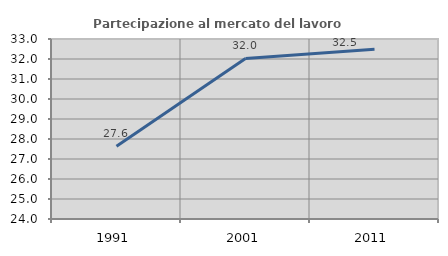
| Category | Partecipazione al mercato del lavoro  femminile |
|---|---|
| 1991.0 | 27.633 |
| 2001.0 | 32.026 |
| 2011.0 | 32.493 |